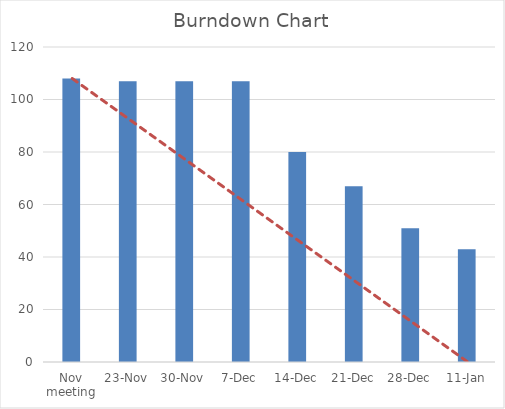
| Category | actual |
|---|---|
| Nov meeting | 108 |
| 23-Nov | 107 |
| 30-Nov | 107 |
| 7-Dec | 107 |
| 14-Dec | 80 |
| 21-Dec | 67 |
| 28-Dec | 51 |
| 11-Jan | 43 |